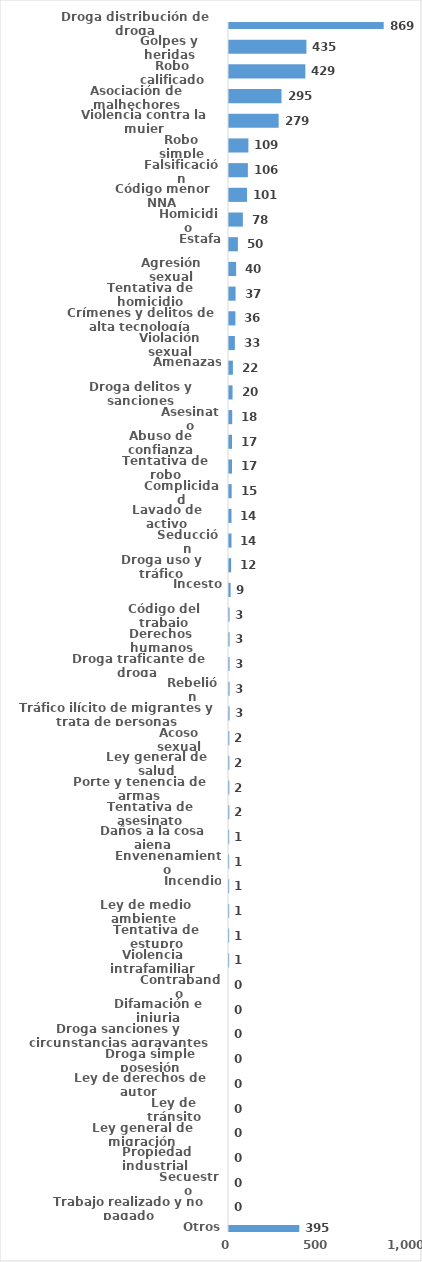
| Category | Series 0 |
|---|---|
| Droga distribución de droga | 869 |
| Golpes y heridas | 435 |
| Robo calificado | 429 |
| Asociación de malhechores | 295 |
| Violencia contra la mujer | 279 |
| Robo simple | 109 |
| Falsificación | 106 |
| Código menor NNA | 101 |
| Homicidio | 78 |
| Estafa | 50 |
| Agresión sexual | 40 |
| Tentativa de homicidio | 37 |
| Crímenes y delitos de alta tecnología | 36 |
| Violación sexual | 33 |
| Amenazas | 22 |
| Droga delitos y sanciones | 20 |
| Asesinato | 18 |
| Abuso de confianza | 17 |
| Tentativa de robo | 17 |
| Complicidad | 15 |
| Lavado de activo | 14 |
| Seducción | 14 |
| Droga uso y tráfico | 12 |
| Incesto | 9 |
| Código del trabajo | 3 |
| Derechos humanos | 3 |
| Droga traficante de droga  | 3 |
| Rebelión | 3 |
| Tráfico ilícito de migrantes y trata de personas | 3 |
| Acoso sexual | 2 |
| Ley general de salud | 2 |
| Porte y tenencia de armas | 2 |
| Tentativa de asesinato | 2 |
| Daños a la cosa ajena | 1 |
| Envenenamiento | 1 |
| Incendio | 1 |
| Ley de medio ambiente  | 1 |
| Tentativa de estupro | 1 |
| Violencia intrafamiliar | 1 |
| Contrabando | 0 |
| Difamación e injuria | 0 |
| Droga sanciones y circunstancias agravantes | 0 |
| Droga simple posesión | 0 |
| Ley de derechos de autor  | 0 |
| Ley de tránsito | 0 |
| Ley general de migración | 0 |
| Propiedad industrial  | 0 |
| Secuestro | 0 |
| Trabajo realizado y no pagado | 0 |
| Otros | 395 |